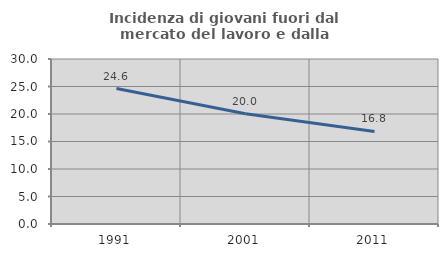
| Category | Incidenza di giovani fuori dal mercato del lavoro e dalla formazione  |
|---|---|
| 1991.0 | 24.635 |
| 2001.0 | 20.045 |
| 2011.0 | 16.83 |